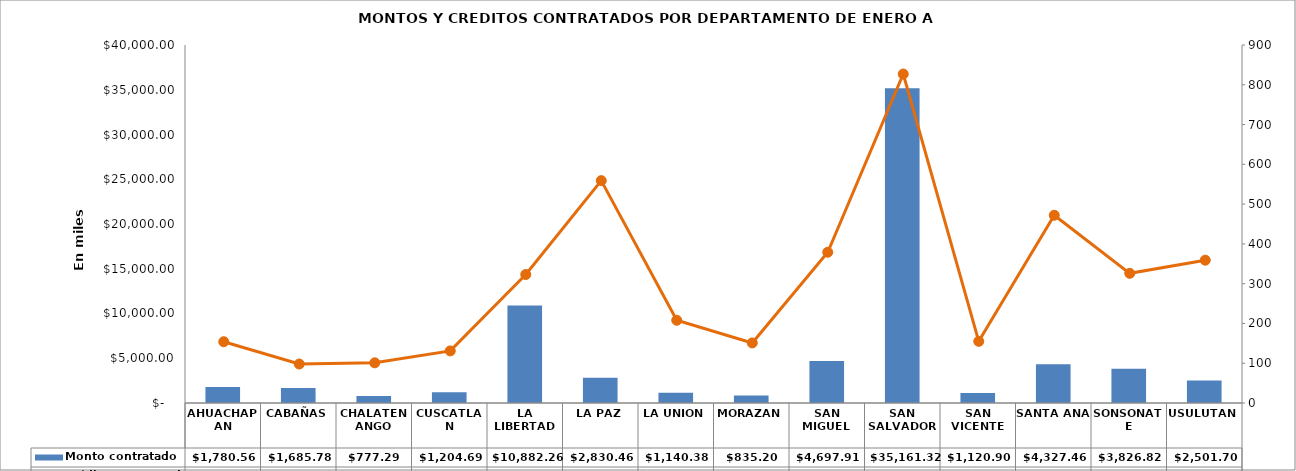
| Category | Monto contratado  |
|---|---|
| AHUACHAPAN | 1780.559 |
| CABAÑAS | 1685.782 |
| CHALATENANGO | 777.287 |
| CUSCATLAN | 1204.695 |
| LA LIBERTAD | 10882.256 |
| LA PAZ | 2830.46 |
| LA UNION | 1140.384 |
| MORAZAN | 835.205 |
| SAN MIGUEL | 4697.909 |
| SAN SALVADOR | 35161.323 |
| SAN VICENTE | 1120.9 |
| SANTA ANA | 4327.456 |
| SONSONATE | 3826.817 |
| USULUTAN | 2501.702 |